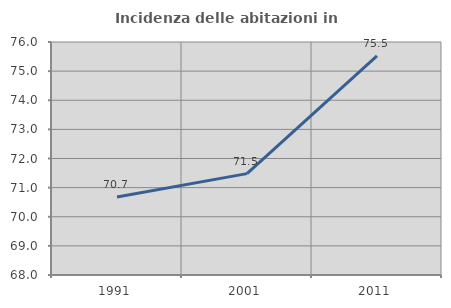
| Category | Incidenza delle abitazioni in proprietà  |
|---|---|
| 1991.0 | 70.678 |
| 2001.0 | 71.48 |
| 2011.0 | 75.524 |